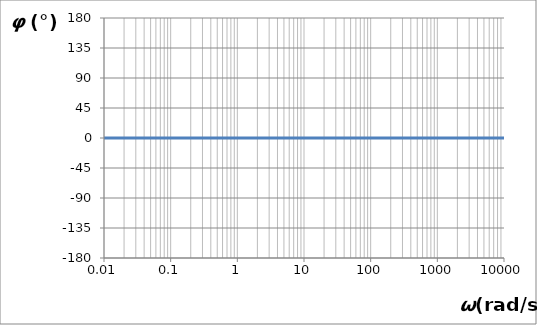
| Category | Series 0 |
|---|---|
| 0.01 | 0 |
| 0.1 | 0 |
| 1.0 | 0 |
| 10.0 | 0 |
| 100.0 | 0 |
| 1000.0 | 0 |
| 10000.0 | 0 |